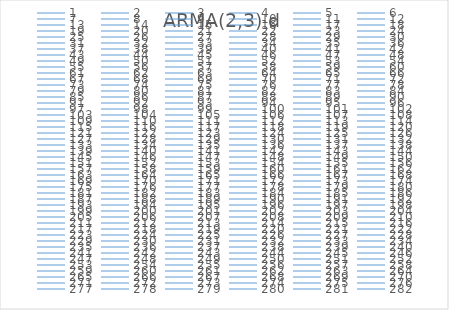
| Category | ARMA(2,3) d |
|---|---|
| 0 | 0 |
| 1 | 7.794 |
| 2 | 12.601 |
| 3 | 18.811 |
| 4 | 23.842 |
| 5 | 29.683 |
| 6 | 37.934 |
| 7 | 45.825 |
| 8 | 53.744 |
| 9 | 64.059 |
| 10 | 74.528 |
| 11 | 83.29 |
| 12 | 94.142 |
| 13 | 105.561 |
| 14 | 116.066 |
| 15 | 127.261 |
| 16 | 139.276 |
| 17 | 149.818 |
| 18 | 160.178 |
| 19 | 171.276 |
| 20 | 181.544 |
| 21 | 192.248 |
| 22 | 202.828 |
| 23 | 212.794 |
| 24 | 222.695 |
| 25 | 233.294 |
| 26 | 243.399 |
| 27 | 252.464 |
| 28 | 262.185 |
| 29 | 271.451 |
| 30 | 281.72 |
| 31 | 292.017 |
| 32 | 300.872 |
| 33 | 309.331 |
| 34 | 319.234 |
| 35 | 330.771 |
| 36 | 342.829 |
| 37 | 355.521 |
| 38 | 369.406 |
| 39 | 382.014 |
| 40 | 392.762 |
| 41 | 403.892 |
| 42 | 415.683 |
| 43 | 425.382 |
| 44 | 437.235 |
| 45 | 449.202 |
| 46 | 461.266 |
| 47 | 473.058 |
| 48 | 486.99 |
| 49 | 499.662 |
| 50 | 513.285 |
| 51 | 527.08 |
| 52 | 539.851 |
| 53 | 551.007 |
| 54 | 563.712 |
| 55 | 576.142 |
| 56 | 588.395 |
| 57 | 601.853 |
| 58 | 614.845 |
| 59 | 628.419 |
| 60 | 640.172 |
| 61 | 653.004 |
| 62 | 665.139 |
| 63 | 676.045 |
| 64 | 689.5 |
| 65 | 700.816 |
| 66 | 715.455 |
| 67 | 728.122 |
| 68 | 740.98 |
| 69 | 755.97 |
| 70 | 769.273 |
| 71 | 783.99 |
| 72 | 797.833 |
| 73 | 812.299 |
| 74 | 827.808 |
| 75 | 843.362 |
| 76 | 859.906 |
| 77 | 875.489 |
| 78 | 891.966 |
| 79 | 907.606 |
| 80 | 924.215 |
| 81 | 940.433 |
| 82 | 956.154 |
| 83 | 972.839 |
| 84 | 989.735 |
| 85 | 1006.624 |
| 86 | 1024.225 |
| 87 | 1040.44 |
| 88 | 1057.752 |
| 89 | 1074.029 |
| 90 | 1090.784 |
| 91 | 1105.334 |
| 92 | 1123.089 |
| 93 | 1140.751 |
| 94 | 1157.43 |
| 95 | 1175.747 |
| 96 | 1192.534 |
| 97 | 1210.216 |
| 98 | 1228.175 |
| 99 | 1249.474 |
| 100 | 1267.358 |
| 101 | 1286.131 |
| 102 | 1304.152 |
| 103 | 1321.642 |
| 104 | 1339.248 |
| 105 | 1356.085 |
| 106 | 1373.421 |
| 107 | 1392.29 |
| 108 | 1410.657 |
| 109 | 1429.392 |
| 110 | 1447.236 |
| 111 | 1465.394 |
| 112 | 1483.159 |
| 113 | 1503.008 |
| 114 | 1523.437 |
| 115 | 1542.252 |
| 116 | 1563.343 |
| 117 | 1582.246 |
| 118 | 1603.744 |
| 119 | 1625.216 |
| 120 | 1646.647 |
| 121 | 1669.93 |
| 122 | 1692.248 |
| 123 | 1715.483 |
| 124 | 1739.417 |
| 125 | 1761.488 |
| 126 | 1786.459 |
| 127 | 1807.925 |
| 128 | 1829.144 |
| 129 | 1850.233 |
| 130 | 1872.251 |
| 131 | 1895.814 |
| 132 | 1919.125 |
| 133 | 1942.868 |
| 134 | 1966.904 |
| 135 | 1990.362 |
| 136 | 2014.633 |
| 137 | 2040.257 |
| 138 | 2064.512 |
| 139 | 2089.76 |
| 140 | 2116.785 |
| 141 | 2144.409 |
| 142 | 2171.569 |
| 143 | 2199.246 |
| 144 | 2227.519 |
| 145 | 2251.308 |
| 146 | 2277.343 |
| 147 | 2305.358 |
| 148 | 2330.639 |
| 149 | 2358.697 |
| 150 | 2387.022 |
| 151 | 2414.159 |
| 152 | 2443.511 |
| 153 | 2473.42 |
| 154 | 2502.254 |
| 155 | 2531.237 |
| 156 | 2558.292 |
| 157 | 2586.266 |
| 158 | 2614.671 |
| 159 | 2642.328 |
| 160 | 2671.714 |
| 161 | 2701.647 |
| 162 | 2732.247 |
| 163 | 2762.777 |
| 164 | 2794.698 |
| 165 | 2826.221 |
| 166 | 2858.398 |
| 167 | 2891.819 |
| 168 | 2924.979 |
| 169 | 2957.455 |
| 170 | 2991.046 |
| 171 | 3023.824 |
| 172 | 3058.613 |
| 173 | 3093.314 |
| 174 | 3126.712 |
| 175 | 3160.515 |
| 176 | 3195.193 |
| 177 | 3227.527 |
| 178 | 3262.87 |
| 179 | 3297.978 |
| 180 | 3331.814 |
| 181 | 3366.056 |
| 182 | 3398.505 |
| 183 | 3433.76 |
| 184 | 3467.248 |
| 185 | 3502.63 |
| 186 | 3539.468 |
| 187 | 3574.771 |
| 188 | 3611.117 |
| 189 | 3648.584 |
| 190 | 3685.617 |
| 191 | 3722.733 |
| 192 | 3759.946 |
| 193 | 3795.841 |
| 194 | 3834.111 |
| 195 | 3872.867 |
| 196 | 3912.599 |
| 197 | 3952.502 |
| 198 | 3994.824 |
| 199 | 4034.645 |
| 200 | 4074.835 |
| 201 | 4116.927 |
| 202 | 4158.506 |
| 203 | 4199.979 |
| 204 | 4241.412 |
| 205 | 4284.341 |
| 206 | 4327.61 |
| 207 | 4371.963 |
| 208 | 4417.515 |
| 209 | 4463.918 |
| 210 | 4509.406 |
| 211 | 4556.108 |
| 212 | 4602.522 |
| 213 | 4647.769 |
| 214 | 4694.294 |
| 215 | 4740.805 |
| 216 | 4786.564 |
| 217 | 4834.322 |
| 218 | 4883.799 |
| 219 | 4931.109 |
| 220 | 4981.154 |
| 221 | 5031.595 |
| 222 | 5080.095 |
| 223 | 5130.411 |
| 224 | 5181.165 |
| 225 | 5231.519 |
| 226 | 5282.644 |
| 227 | 5335.165 |
| 228 | 5386.869 |
| 229 | 5440.657 |
| 230 | 5492.116 |
| 231 | 5543.98 |
| 232 | 5595.766 |
| 233 | 5649.613 |
| 234 | 5704.895 |
| 235 | 5762.137 |
| 236 | 5820.209 |
| 237 | 5878.501 |
| 238 | 5936.126 |
| 239 | 5992.674 |
| 240 | 6052.904 |
| 241 | 6111.599 |
| 242 | 6171.593 |
| 243 | 6229.967 |
| 244 | 6291.118 |
| 245 | 6351.32 |
| 246 | 6412.96 |
| 247 | 6476.156 |
| 248 | 6539.598 |
| 249 | 6602.132 |
| 250 | 6667.68 |
| 251 | 6731.723 |
| 252 | 6798.164 |
| 253 | 6862.752 |
| 254 | 6926.983 |
| 255 | 6991.379 |
| 256 | 7055.615 |
| 257 | 7121.07 |
| 258 | 7187.575 |
| 259 | 7253.915 |
| 260 | 7321.283 |
| 261 | 7390.58 |
| 262 | 7459.173 |
| 263 | 7530.533 |
| 264 | 7601.368 |
| 265 | 7672.362 |
| 266 | 7743.631 |
| 267 | 7816.659 |
| 268 | 7888.536 |
| 269 | 7960.038 |
| 270 | 8033.146 |
| 271 | 8106.591 |
| 272 | 8181.229 |
| 273 | 8257.611 |
| 274 | 8335.79 |
| 275 | 8413.737 |
| 276 | 8492.949 |
| 277 | 8573.036 |
| 278 | 8652.719 |
| 279 | 8732.039 |
| 280 | 8812.931 |
| 281 | 8892.838 |